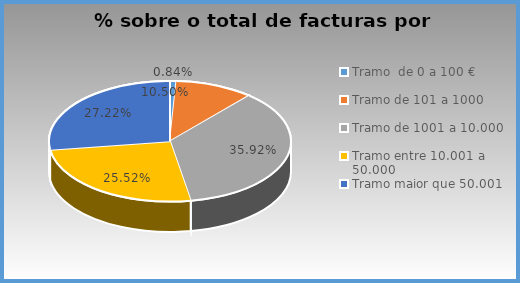
| Category | Series 0 |
|---|---|
| Tramo  de 0 a 100 € | 0.008 |
| Tramo de 101 a 1000 | 0.105 |
| Tramo de 1001 a 10.000 | 0.359 |
| Tramo entre 10.001 a 50.000 | 0.255 |
| Tramo maior que 50.001 | 0.272 |